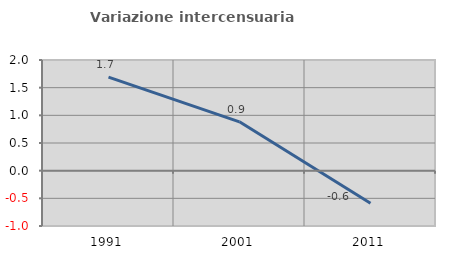
| Category | Variazione intercensuaria annua |
|---|---|
| 1991.0 | 1.691 |
| 2001.0 | 0.883 |
| 2011.0 | -0.588 |